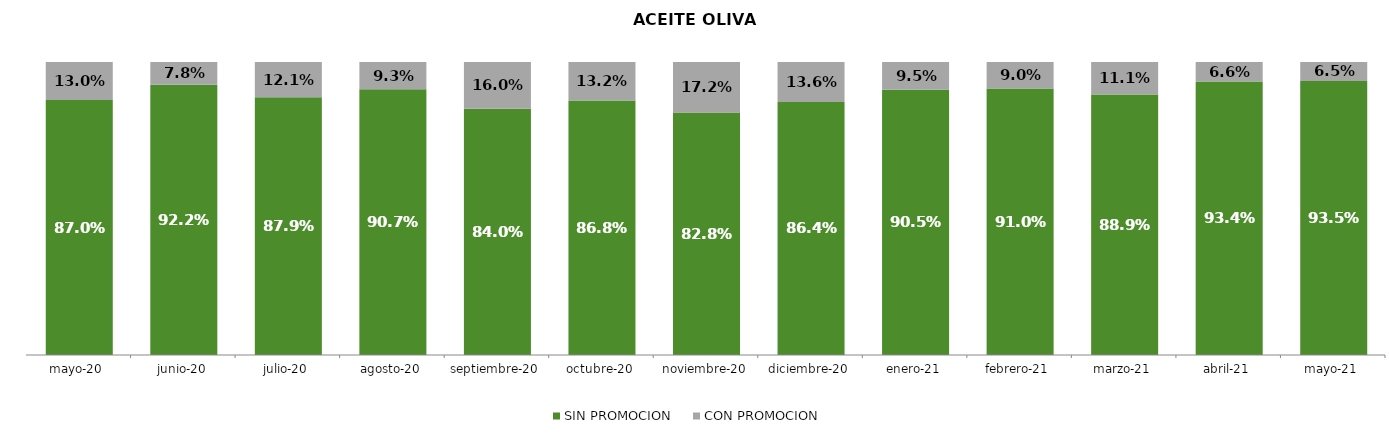
| Category | SIN PROMOCION   | CON PROMOCION   |
|---|---|---|
| 2020-05-01 | 0.87 | 0.13 |
| 2020-06-01 | 0.922 | 0.078 |
| 2020-07-01 | 0.879 | 0.121 |
| 2020-08-01 | 0.907 | 0.093 |
| 2020-09-01 | 0.84 | 0.16 |
| 2020-10-01 | 0.868 | 0.132 |
| 2020-11-01 | 0.828 | 0.172 |
| 2020-12-01 | 0.864 | 0.136 |
| 2021-01-01 | 0.905 | 0.095 |
| 2021-02-01 | 0.91 | 0.09 |
| 2021-03-01 | 0.889 | 0.111 |
| 2021-04-01 | 0.934 | 0.066 |
| 2021-05-01 | 0.935 | 0.065 |